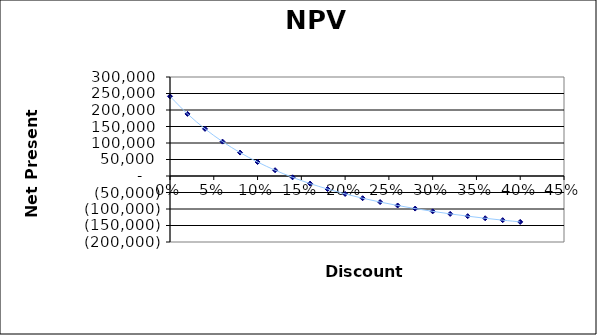
| Category | Series 0 |
|---|---|
| 0.0 | 241500 |
| 0.02 | 188123.719 |
| 0.04 | 142825.085 |
| 0.06 | 104167.849 |
| 0.08 | 70999.709 |
| 0.1 | 42391.363 |
| 0.12000000000000001 | 17589.57 |
| 0.14 | -4019.186 |
| 0.16 | -22936.985 |
| 0.18 | -39576.603 |
| 0.19999999999999998 | -54278.914 |
| 0.21999999999999997 | -67326.64 |
| 0.23999999999999996 | -78955.265 |
| 0.25999999999999995 | -89361.735 |
| 0.27999999999999997 | -98711.43 |
| 0.3 | -107143.762 |
| 0.32 | -114776.706 |
| 0.34 | -121710.469 |
| 0.36000000000000004 | -128030.471 |
| 0.38000000000000006 | -133809.793 |
| 0.4000000000000001 | -139111.169 |